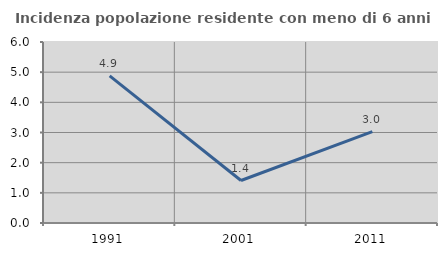
| Category | Incidenza popolazione residente con meno di 6 anni |
|---|---|
| 1991.0 | 4.878 |
| 2001.0 | 1.408 |
| 2011.0 | 3.03 |